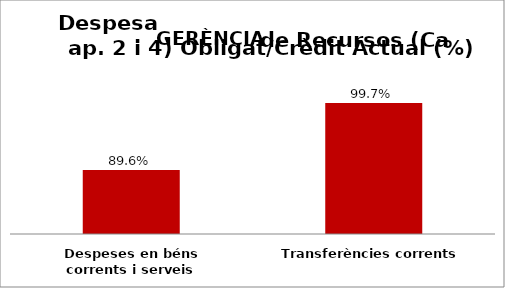
| Category | Series 0 |
|---|---|
| Despeses en béns corrents i serveis | 0.896 |
| Transferències corrents | 0.997 |